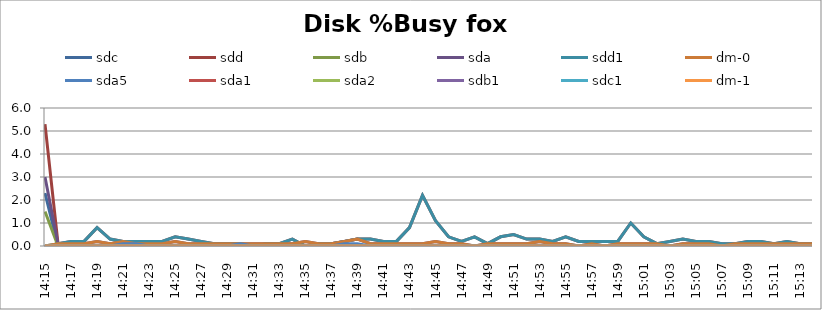
| Category | sdc | sdd | sdb | sda | sdd1 | dm-0 | sda5 | sda1 | sda2 | sdb1 | sdc1 | dm-1 |
|---|---|---|---|---|---|---|---|---|---|---|---|---|
| 14:15 | 2.3 | 5.3 | 1.5 | 3 | 0 | 0 | 0 | 0 | 0 | 0 | 0 | 0 |
| 14:16 | 0 | 0.1 | 0 | 0.1 | 0.1 | 0.1 | 0 | 0 | 0 | 0 | 0 | 0 |
| 14:17 | 0 | 0.2 | 0 | 0.1 | 0.2 | 0.1 | 0 | 0 | 0 | 0 | 0 | 0 |
| 14:18 | 0 | 0.2 | 0 | 0.1 | 0.2 | 0.1 | 0 | 0 | 0 | 0 | 0 | 0 |
| 14:19 | 0 | 0.8 | 0 | 0.2 | 0.8 | 0.2 | 0 | 0 | 0 | 0 | 0 | 0 |
| 14:20 | 0 | 0.3 | 0 | 0.1 | 0.3 | 0.1 | 0 | 0 | 0 | 0 | 0 | 0 |
| 14:21 | 0 | 0.2 | 0 | 0.2 | 0.2 | 0.2 | 0.1 | 0 | 0 | 0 | 0 | 0 |
| 14:22 | 0 | 0.2 | 0 | 0.1 | 0.2 | 0.1 | 0.1 | 0 | 0 | 0 | 0 | 0 |
| 14:23 | 0 | 0.2 | 0 | 0.1 | 0.2 | 0.1 | 0 | 0 | 0 | 0 | 0 | 0 |
| 14:24 | 0 | 0.2 | 0 | 0.1 | 0.2 | 0.1 | 0 | 0 | 0 | 0 | 0 | 0 |
| 14:25 | 0 | 0.4 | 0 | 0.2 | 0.4 | 0.2 | 0 | 0 | 0 | 0 | 0 | 0 |
| 14:26 | 0 | 0.3 | 0 | 0.1 | 0.3 | 0.1 | 0 | 0 | 0 | 0 | 0 | 0 |
| 14:27 | 0 | 0.2 | 0 | 0.1 | 0.2 | 0.1 | 0 | 0 | 0 | 0 | 0 | 0 |
| 14:28 | 0 | 0.1 | 0 | 0.1 | 0.1 | 0.1 | 0 | 0 | 0 | 0 | 0 | 0 |
| 14:29 | 0 | 0.1 | 0 | 0.1 | 0.1 | 0.1 | 0 | 0 | 0 | 0 | 0 | 0 |
| 14:30 | 0 | 0.1 | 0 | 0.1 | 0.1 | 0.1 | 0.1 | 0 | 0 | 0 | 0 | 0 |
| 14:31 | 0 | 0 | 0 | 0.1 | 0 | 0.1 | 0 | 0 | 0 | 0 | 0 | 0 |
| 14:32 | 0 | 0.1 | 0 | 0.1 | 0.1 | 0.1 | 0 | 0 | 0 | 0 | 0 | 0 |
| 14:33 | 0 | 0.1 | 0 | 0.1 | 0.1 | 0.1 | 0 | 0 | 0 | 0 | 0 | 0 |
| 14:34 | 0 | 0.3 | 0 | 0.1 | 0.3 | 0.1 | 0 | 0 | 0 | 0 | 0 | 0 |
| 14:35 | 0 | 0 | 0 | 0.2 | 0 | 0.2 | 0 | 0 | 0 | 0 | 0 | 0 |
| 14:36 | 0 | 0.1 | 0 | 0.1 | 0.1 | 0.1 | 0 | 0 | 0 | 0 | 0 | 0 |
| 14:37 | 0 | 0.1 | 0 | 0.1 | 0.1 | 0.1 | 0 | 0 | 0 | 0 | 0 | 0 |
| 14:38 | 0 | 0.2 | 0 | 0.2 | 0.2 | 0.2 | 0.1 | 0 | 0 | 0 | 0 | 0 |
| 14:39 | 0 | 0.3 | 0 | 0.3 | 0.3 | 0.3 | 0.1 | 0 | 0 | 0 | 0 | 0 |
| 14:40 | 0 | 0.3 | 0 | 0.1 | 0.3 | 0.1 | 0 | 0 | 0 | 0 | 0 | 0 |
| 14:41 | 0 | 0.2 | 0 | 0.1 | 0.2 | 0.1 | 0 | 0 | 0 | 0 | 0 | 0 |
| 14:42 | 0 | 0.2 | 0 | 0.1 | 0.2 | 0.1 | 0 | 0 | 0 | 0 | 0 | 0 |
| 14:43 | 0 | 0.8 | 0 | 0.1 | 0.8 | 0.1 | 0 | 0 | 0 | 0 | 0 | 0 |
| 14:44 | 0 | 2.2 | 0 | 0.1 | 2.2 | 0.1 | 0 | 0 | 0 | 0 | 0 | 0 |
| 14:45 | 0 | 1.1 | 0 | 0.2 | 1.1 | 0.2 | 0 | 0 | 0 | 0 | 0 | 0 |
| 14:46 | 0 | 0.4 | 0 | 0.1 | 0.4 | 0.1 | 0 | 0 | 0 | 0 | 0 | 0 |
| 14:47 | 0 | 0.2 | 0 | 0.1 | 0.2 | 0.1 | 0 | 0 | 0 | 0 | 0 | 0 |
| 14:48 | 0 | 0.4 | 0 | 0 | 0.4 | 0 | 0 | 0 | 0 | 0 | 0 | 0 |
| 14:49 | 0 | 0.1 | 0 | 0.1 | 0.1 | 0.1 | 0 | 0 | 0 | 0 | 0 | 0 |
| 14:50 | 0 | 0.4 | 0 | 0.1 | 0.4 | 0.1 | 0 | 0 | 0 | 0 | 0 | 0 |
| 14:51 | 0 | 0.5 | 0 | 0.1 | 0.5 | 0.1 | 0 | 0 | 0 | 0 | 0 | 0 |
| 14:52 | 0 | 0.3 | 0 | 0.1 | 0.3 | 0.1 | 0 | 0 | 0 | 0 | 0 | 0 |
| 14:53 | 0 | 0.3 | 0 | 0.2 | 0.3 | 0.2 | 0 | 0 | 0 | 0 | 0 | 0 |
| 14:54 | 0 | 0.2 | 0 | 0.1 | 0.2 | 0.1 | 0 | 0 | 0 | 0 | 0 | 0 |
| 14:55 | 0 | 0.4 | 0 | 0.1 | 0.4 | 0.1 | 0 | 0 | 0 | 0 | 0 | 0 |
| 14:56 | 0 | 0.2 | 0 | 0 | 0.2 | 0 | 0 | 0 | 0 | 0 | 0 | 0 |
| 14:57 | 0 | 0.2 | 0 | 0.1 | 0.2 | 0.1 | 0 | 0 | 0 | 0 | 0 | 0 |
| 14:58 | 0 | 0.2 | 0 | 0 | 0.2 | 0 | 0 | 0 | 0 | 0 | 0 | 0 |
| 14:59 | 0 | 0.2 | 0 | 0.1 | 0.2 | 0.1 | 0 | 0 | 0 | 0 | 0 | 0 |
| 15:00 | 0 | 1 | 0 | 0.1 | 1 | 0.1 | 0 | 0 | 0 | 0 | 0 | 0 |
| 15:01 | 0 | 0.4 | 0 | 0.1 | 0.4 | 0.1 | 0 | 0 | 0 | 0 | 0 | 0 |
| 15:02 | 0 | 0.1 | 0 | 0.1 | 0.1 | 0.1 | 0 | 0 | 0 | 0 | 0 | 0 |
| 15:03 | 0 | 0.2 | 0 | 0 | 0.2 | 0 | 0 | 0 | 0 | 0 | 0 | 0 |
| 15:04 | 0 | 0.3 | 0 | 0.1 | 0.3 | 0.1 | 0 | 0 | 0 | 0 | 0 | 0 |
| 15:05 | 0 | 0.2 | 0 | 0.1 | 0.2 | 0.1 | 0 | 0 | 0 | 0 | 0 | 0 |
| 15:06 | 0 | 0.2 | 0 | 0.1 | 0.2 | 0.1 | 0 | 0 | 0 | 0 | 0 | 0 |
| 15:07 | 0 | 0.1 | 0 | 0 | 0.1 | 0 | 0 | 0 | 0 | 0 | 0 | 0 |
| 15:08 | 0 | 0.1 | 0 | 0.1 | 0.1 | 0.1 | 0 | 0 | 0 | 0 | 0 | 0 |
| 15:09 | 0 | 0.2 | 0 | 0.1 | 0.2 | 0.1 | 0 | 0 | 0 | 0 | 0 | 0 |
| 15:10 | 0 | 0.2 | 0 | 0.1 | 0.2 | 0.1 | 0 | 0 | 0 | 0 | 0 | 0 |
| 15:11 | 0 | 0.1 | 0 | 0.1 | 0.1 | 0.1 | 0 | 0 | 0 | 0 | 0 | 0 |
| 15:12 | 0 | 0.2 | 0 | 0.1 | 0.2 | 0.1 | 0 | 0 | 0 | 0 | 0 | 0 |
| 15:13 | 0 | 0.1 | 0 | 0.1 | 0.1 | 0.1 | 0 | 0 | 0 | 0 | 0 | 0 |
| 15:14 | 0 | 0.1 | 0 | 0.1 | 0.1 | 0.1 | 0 | 0 | 0 | 0 | 0 | 0 |